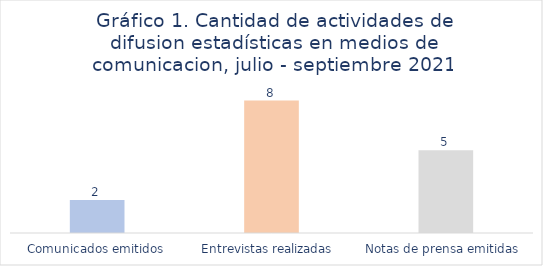
| Category | Series 0 |
|---|---|
| Comunicados emitidos | 2 |
| Entrevistas realizadas  | 8 |
| Notas de prensa emitidas  | 5 |